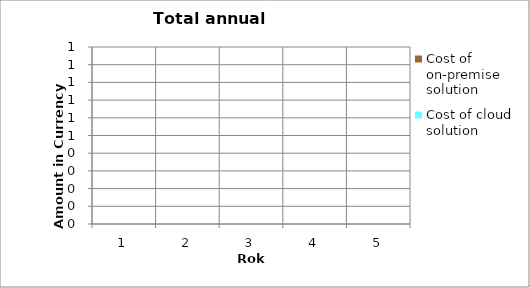
| Category | Cost of on-premise solution | Cost of cloud solution |
|---|---|---|
| 0 | 0 | 0 |
| 1 | 0 | 0 |
| 2 | 0 | 0 |
| 3 | 0 | 0 |
| 4 | 0 | 0 |